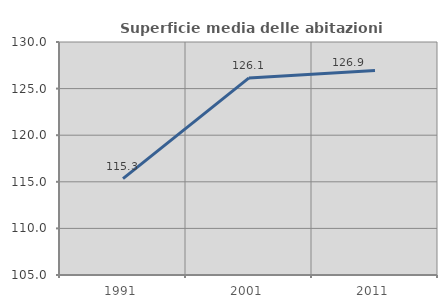
| Category | Superficie media delle abitazioni occupate |
|---|---|
| 1991.0 | 115.334 |
| 2001.0 | 126.147 |
| 2011.0 | 126.932 |